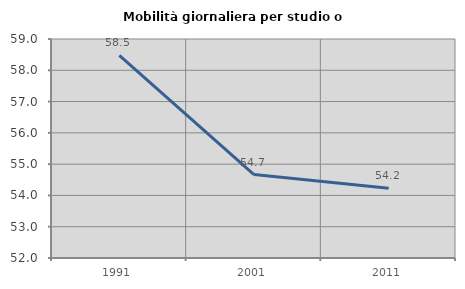
| Category | Mobilità giornaliera per studio o lavoro |
|---|---|
| 1991.0 | 58.477 |
| 2001.0 | 54.669 |
| 2011.0 | 54.23 |